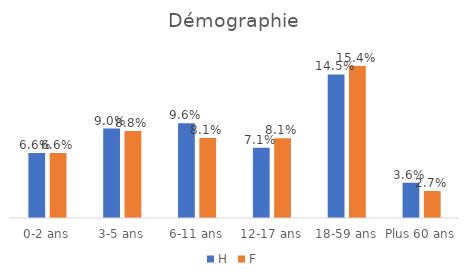
| Category | H | F |
|---|---|---|
| 0-2 ans | 0.066 | 0.066 |
| 3-5 ans | 0.09 | 0.088 |
| 6-11 ans | 0.096 | 0.081 |
| 12-17 ans | 0.071 | 0.081 |
| 18-59 ans | 0.145 | 0.154 |
| Plus 60 ans | 0.036 | 0.027 |